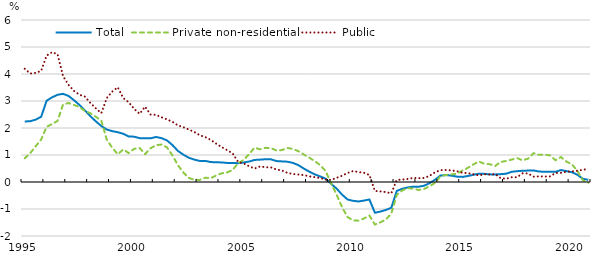
| Category | Total | Private non-residential | Public |
|---|---|---|---|
| 1995.0 | 2.241 | 0.877 | 4.194 |
| nan | 2.252 | 1.067 | 4.019 |
| nan | 2.31 | 1.325 | 4.041 |
| nan | 2.415 | 1.574 | 4.114 |
| 1996.0 | 3.009 | 2.046 | 4.682 |
| nan | 3.136 | 2.146 | 4.81 |
| nan | 3.23 | 2.263 | 4.732 |
| nan | 3.265 | 2.869 | 3.923 |
| 1997.0 | 3.188 | 2.926 | 3.6 |
| nan | 3.03 | 2.853 | 3.373 |
| nan | 2.854 | 2.778 | 3.23 |
| nan | 2.654 | 2.627 | 3.162 |
| 1998.0 | 2.437 | 2.548 | 2.926 |
| nan | 2.245 | 2.415 | 2.724 |
| nan | 2.072 | 2.266 | 2.551 |
| nan | 1.943 | 1.567 | 3.111 |
| 1999.0 | 1.883 | 1.269 | 3.351 |
| nan | 1.844 | 1.028 | 3.509 |
| nan | 1.786 | 1.205 | 3.11 |
| nan | 1.688 | 1.071 | 2.952 |
| 2000.0 | 1.678 | 1.229 | 2.708 |
| nan | 1.625 | 1.26 | 2.525 |
| nan | 1.621 | 1.035 | 2.79 |
| nan | 1.619 | 1.251 | 2.499 |
| 2001.0 | 1.667 | 1.364 | 2.488 |
| nan | 1.625 | 1.387 | 2.397 |
| nan | 1.54 | 1.282 | 2.321 |
| nan | 1.368 | 0.987 | 2.23 |
| 2002.0 | 1.151 | 0.62 | 2.098 |
| nan | 1.011 | 0.349 | 2.028 |
| nan | 0.897 | 0.152 | 1.942 |
| nan | 0.83 | 0.081 | 1.851 |
| 2003.0 | 0.779 | 0.078 | 1.731 |
| nan | 0.782 | 0.158 | 1.665 |
| nan | 0.738 | 0.143 | 1.558 |
| nan | 0.731 | 0.241 | 1.419 |
| 2004.0 | 0.724 | 0.322 | 1.293 |
| nan | 0.706 | 0.355 | 1.178 |
| nan | 0.707 | 0.452 | 1.058 |
| nan | 0.696 | 0.692 | 0.745 |
| 2005.0 | 0.724 | 0.818 | 0.69 |
| nan | 0.757 | 1.028 | 0.584 |
| nan | 0.817 | 1.272 | 0.498 |
| nan | 0.828 | 1.211 | 0.576 |
| 2006.0 | 0.843 | 1.265 | 0.548 |
| nan | 0.84 | 1.254 | 0.538 |
| nan | 0.776 | 1.167 | 0.465 |
| nan | 0.763 | 1.183 | 0.427 |
| 2007.0 | 0.752 | 1.259 | 0.342 |
| nan | 0.708 | 1.227 | 0.295 |
| nan | 0.626 | 1.143 | 0.276 |
| nan | 0.498 | 1.019 | 0.255 |
| 2008.0 | 0.384 | 0.902 | 0.211 |
| nan | 0.283 | 0.773 | 0.178 |
| nan | 0.207 | 0.623 | 0.15 |
| nan | 0.122 | 0.407 | 0.089 |
| 2009.0 | -0.067 | -0.05 | 0.077 |
| nan | -0.244 | -0.466 | 0.154 |
| nan | -0.469 | -0.931 | 0.231 |
| nan | -0.647 | -1.297 | 0.334 |
| 2010.0 | -0.697 | -1.42 | 0.406 |
| nan | -0.721 | -1.432 | 0.369 |
| nan | -0.687 | -1.351 | 0.343 |
| nan | -0.648 | -1.244 | 0.259 |
| 2011.0 | -1.138 | -1.575 | -0.331 |
| nan | -1.095 | -1.496 | -0.348 |
| nan | -1.036 | -1.39 | -0.372 |
| nan | -0.953 | -1.172 | -0.421 |
| 2012.0 | -0.33 | -0.478 | 0.078 |
| nan | -0.252 | -0.313 | 0.087 |
| nan | -0.2 | -0.226 | 0.114 |
| nan | -0.174 | -0.247 | 0.151 |
| 2013.0 | -0.174 | -0.296 | 0.14 |
| nan | -0.137 | -0.255 | 0.151 |
| nan | -0.043 | -0.155 | 0.23 |
| nan | 0.086 | -0.034 | 0.361 |
| 2014.0 | 0.239 | 0.217 | 0.439 |
| nan | 0.256 | 0.26 | 0.443 |
| nan | 0.236 | 0.282 | 0.431 |
| nan | 0.199 | 0.308 | 0.399 |
| 2015.0 | 0.189 | 0.425 | 0.343 |
| nan | 0.222 | 0.526 | 0.33 |
| nan | 0.268 | 0.65 | 0.286 |
| nan | 0.308 | 0.759 | 0.245 |
| 2016.0 | 0.302 | 0.675 | 0.286 |
| nan | 0.283 | 0.659 | 0.275 |
| nan | 0.281 | 0.595 | 0.293 |
| nan | 0.291 | 0.745 | 0.14 |
| 2017.0 | 0.306 | 0.776 | 0.12 |
| nan | 0.377 | 0.831 | 0.177 |
| nan | 0.4 | 0.887 | 0.179 |
| nan | 0.416 | 0.802 | 0.321 |
| 2018.0 | 0.423 | 0.865 | 0.316 |
| nan | 0.428 | 1.068 | 0.199 |
| nan | 0.388 | 1.006 | 0.21 |
| nan | 0.379 | 1.012 | 0.202 |
| 2019.0 | 0.378 | 0.988 | 0.208 |
| nan | 0.376 | 0.806 | 0.331 |
| nan | 0.443 | 0.926 | 0.341 |
| nan | 0.402 | 0.756 | 0.38 |
| 2020.0 | 0.362 | 0.66 | 0.39 |
| nan | 0.27 | 0.414 | 0.421 |
| nan | 0.12 | 0.066 | 0.449 |
| nan | 0.08 | -0.025 | 0.494 |